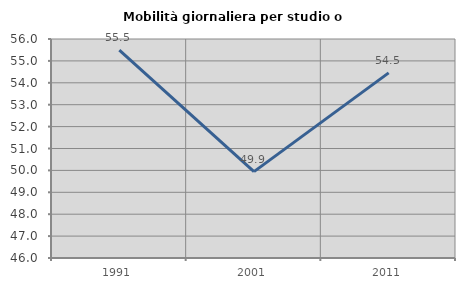
| Category | Mobilità giornaliera per studio o lavoro |
|---|---|
| 1991.0 | 55.488 |
| 2001.0 | 49.944 |
| 2011.0 | 54.453 |